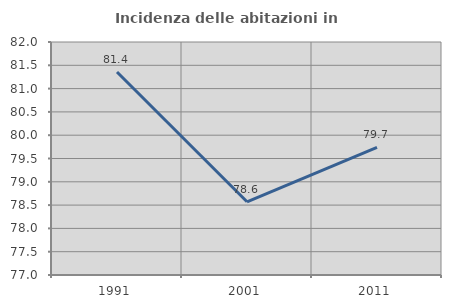
| Category | Incidenza delle abitazioni in proprietà  |
|---|---|
| 1991.0 | 81.356 |
| 2001.0 | 78.571 |
| 2011.0 | 79.74 |